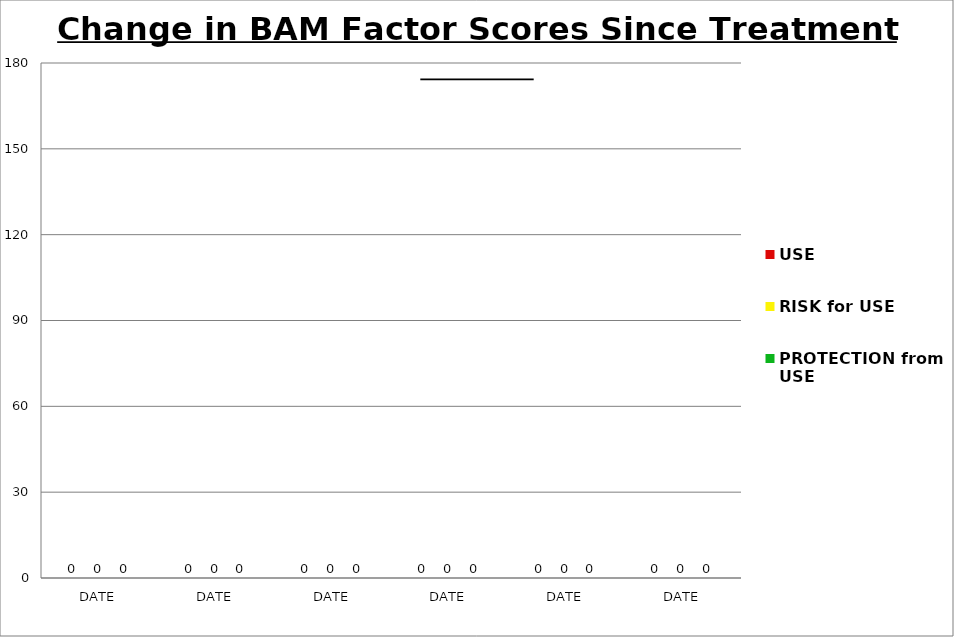
| Category | USE | RISK for USE | PROTECTION from USE |
|---|---|---|---|
| DATE | 0 | 0 | 0 |
| DATE | 0 | 0 | 0 |
| DATE | 0 | 0 | 0 |
| DATE | 0 | 0 | 0 |
| DATE | 0 | 0 | 0 |
| DATE | 0 | 0 | 0 |